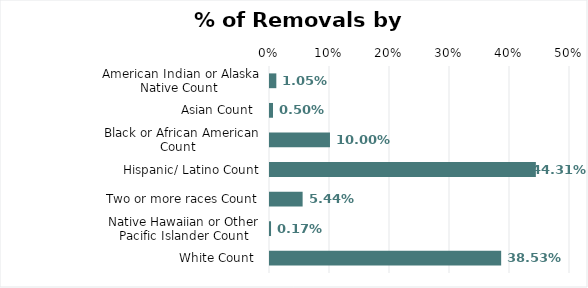
| Category | % of Total Removals |
|---|---|
| American Indian or Alaska Native Count  | 0.011 |
| Asian Count  | 0.005 |
| Black or African American Count   | 0.1 |
| Hispanic/ Latino Count | 0.443 |
| Two or more races Count | 0.054 |
| Native Hawaiian or Other Pacific Islander Count | 0.002 |
| White Count  | 0.385 |